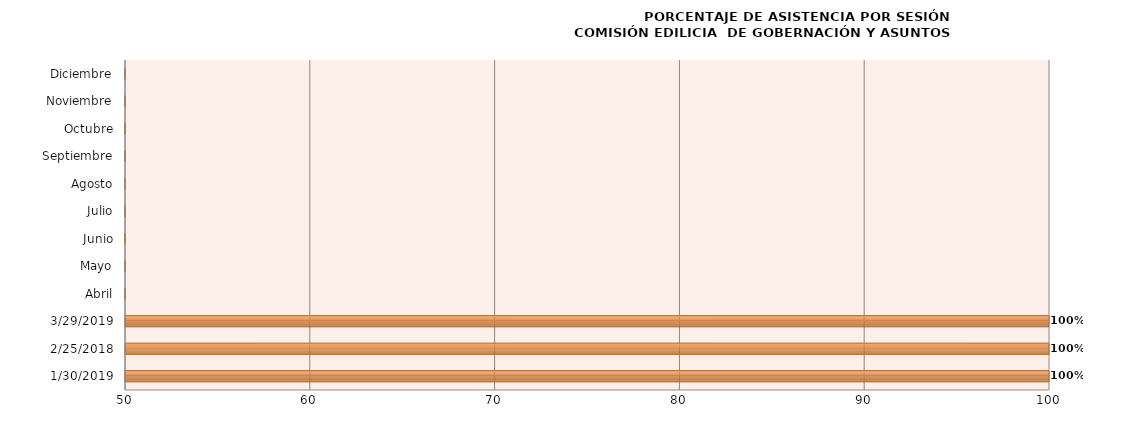
| Category | Series 0 |
|---|---|
| 30/01/2019 | 100 |
| 25/02/2018 | 100 |
| 29/03/2019 | 100 |
| Abril | 0 |
| Mayo | 0 |
| Junio | 0 |
| Julio | 0 |
| Agosto | 0 |
| Septiembre | 0 |
| Octubre | 0 |
| Noviembre | 0 |
| Diciembre | 0 |